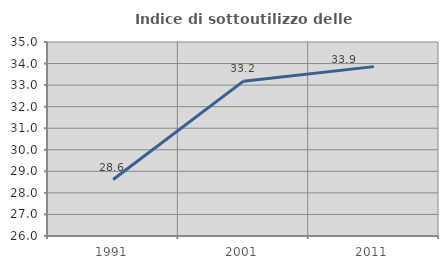
| Category | Indice di sottoutilizzo delle abitazioni  |
|---|---|
| 1991.0 | 28.619 |
| 2001.0 | 33.184 |
| 2011.0 | 33.858 |